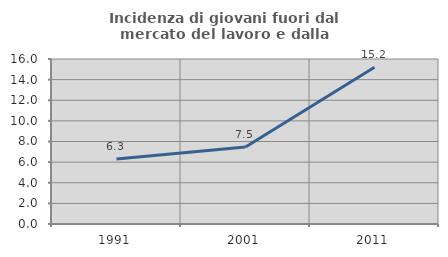
| Category | Incidenza di giovani fuori dal mercato del lavoro e dalla formazione  |
|---|---|
| 1991.0 | 6.309 |
| 2001.0 | 7.469 |
| 2011.0 | 15.205 |